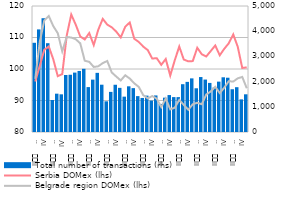
| Category | Total number of transactions (rhs) |
|---|---|
| I | 3540 |
| II
     2008 | 4071 |
| III | 4515 |
| IV | 3524 |
| I
2009 | 1271 |
| II
     2009 | 1521 |
| III | 1495 |
| IV
 | 2262 |
| I
2010 | 2272 |
| II
     2010 | 2357 |
| III | 2422 |
| IV | 2508 |
| I
2011 | 1782 |
| II
     2011 | 2078 |
| III | 2347 |
| IV | 1877 |
| I
2012 | 1218 |
| II
     2012 | 1592 |
| III | 1875 |
| IV | 1752 |
| I
2013 | 1403 |
| II
     2013 | 1813 |
| III | 1741 |
| IV | 1424 |
| I
2014 | 1351 |
| II
     2014 | 1443 |
| III | 1247 |
| IV | 1451 |
| I
2015 | 1113 |
| II
     2015 | 1363 |
| III | 1466 |
| IV | 1385 |
| I
2016 | 1384 |
| II
     2016 | 1897 |
| III | 1989 |
| IV | 2128 |
| I
2017 | 1735 |
| II
     2017 | 2181 |
| III | 2081 |
| IV | 1948 |
| I
2018 | 1765 |
| II
     2018 | 1999 |
| III | 2171 |
| IV | 2154 |
| I
2019 | 1697 |
| II
     2019 | 1778 |
| III | 1295 |